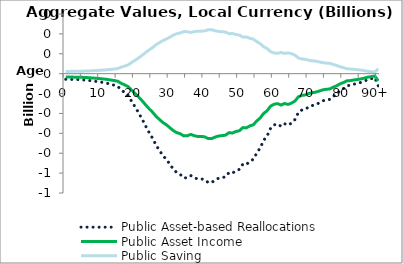
| Category | Public Asset-based Reallocations | Public Asset Income | Public Saving |
|---|---|---|---|
| 0 | -28.464 | -16.972 | 11.491 |
|  | -28.445 | -16.961 | 11.484 |
| 2 | -29.093 | -17.348 | 11.745 |
| 3 | -29.413 | -17.539 | 11.875 |
| 4 | -29.834 | -17.789 | 12.044 |
| 5 | -31.411 | -18.73 | 12.681 |
| 6 | -32.855 | -19.591 | 13.264 |
| 7 | -35.005 | -20.873 | 14.132 |
| 8 | -37.003 | -22.064 | 14.939 |
| 9 | -39.667 | -23.653 | 16.014 |
| 10 | -42.138 | -25.126 | 17.012 |
| 11 | -45.221 | -26.964 | 18.256 |
| 12 | -48.731 | -29.057 | 19.673 |
| 13 | -53.652 | -31.992 | 21.66 |
| 14 | -57.969 | -34.566 | 23.403 |
| 15 | -64.15 | -38.251 | 25.898 |
| 16 | -81.967 | -48.876 | 33.092 |
| 17 | -95.029 | -56.664 | 38.365 |
| 18 | -109.429 | -65.251 | 44.178 |
| 19 | -139.893 | -83.416 | 56.477 |
| 20 | -167.658 | -99.972 | 67.686 |
| 21 | -196.954 | -117.441 | 79.514 |
| 22 | -228.679 | -136.358 | 92.322 |
| 23 | -263.045 | -156.849 | 106.196 |
| 24 | -295.512 | -176.209 | 119.303 |
| 25 | -324.404 | -193.437 | 130.967 |
| 26 | -359.612 | -214.43 | 145.181 |
| 27 | -386.588 | -230.516 | 156.072 |
| 28 | -412.55 | -245.997 | 166.553 |
| 29 | -431.483 | -257.286 | 174.197 |
| 30 | -455.659 | -271.702 | 183.957 |
| 31 | -480.752 | -286.664 | 194.087 |
| 32 | -497.594 | -296.707 | 200.887 |
| 33 | -507.146 | -302.403 | 204.743 |
| 34 | -524.607 | -312.814 | 211.792 |
| 35 | -523.218 | -311.986 | 211.232 |
| 36 | -512.389 | -305.529 | 206.86 |
| 37 | -522.843 | -311.762 | 211.08 |
| 38 | -529.588 | -315.785 | 213.803 |
| 39 | -529.246 | -315.581 | 213.665 |
| 40 | -532.517 | -317.531 | 214.986 |
| 41 | -547.027 | -326.183 | 220.844 |
| 42 | -547.459 | -326.441 | 221.018 |
| 43 | -535.187 | -319.123 | 216.064 |
| 44 | -525.617 | -313.417 | 212.2 |
| 45 | -522.471 | -311.541 | 210.93 |
| 46 | -518.651 | -309.263 | 209.388 |
| 47 | -497.739 | -296.794 | 200.946 |
| 48 | -500.302 | -298.322 | 201.98 |
| 49 | -487.584 | -290.738 | 196.846 |
| 50 | -481.422 | -287.064 | 194.358 |
| 51 | -454.895 | -271.247 | 183.649 |
| 52 | -457.167 | -272.601 | 184.566 |
| 53 | -440.998 | -262.96 | 178.038 |
| 54 | -430.719 | -256.831 | 173.888 |
| 55 | -399.323 | -238.11 | 161.213 |
| 56 | -373.502 | -222.713 | 150.789 |
| 57 | -335.187 | -199.866 | 135.32 |
| 58 | -312.585 | -186.389 | 126.196 |
| 59 | -273.875 | -163.307 | 110.568 |
| 60 | -257.405 | -153.486 | 103.919 |
| 61 | -252.917 | -150.81 | 102.107 |
| 62 | -264.672 | -157.82 | 106.853 |
| 63 | -251.452 | -149.937 | 101.515 |
| 64 | -259.185 | -154.548 | 104.637 |
| 65 | -248.64 | -148.26 | 100.38 |
| 66 | -230.878 | -137.669 | 93.209 |
| 67 | -195.393 | -116.51 | 78.883 |
| 68 | -182.854 | -109.033 | 73.821 |
| 69 | -179.239 | -106.877 | 72.362 |
| 70 | -166.39 | -99.216 | 67.174 |
| 71 | -160.37 | -95.626 | 64.744 |
| 72 | -155.671 | -92.824 | 62.847 |
| 73 | -146.654 | -87.447 | 59.206 |
| 74 | -136.543 | -81.418 | 55.125 |
| 75 | -131.736 | -78.552 | 53.184 |
| 76 | -129.41 | -77.165 | 52.245 |
| 77 | -114.6 | -68.334 | 46.266 |
| 78 | -102.797 | -61.296 | 41.501 |
| 79 | -85.756 | -51.135 | 34.621 |
| 80 | -74.647 | -44.511 | 30.136 |
| 81 | -60.396 | -36.013 | 24.383 |
| 82 | -58.329 | -34.781 | 23.549 |
| 83 | -52.783 | -31.474 | 21.309 |
| 84 | -49.5 | -29.516 | 19.984 |
| 85 | -44.036 | -26.258 | 17.778 |
| 86 | -37.358 | -22.276 | 15.082 |
| 87 | -29.158 | -17.386 | 11.771 |
| 88 | -25.149 | -14.996 | 10.153 |
| 89 | -20.033 | -11.945 | 8.088 |
| 90+ | -60.927 | -36.33 | 24.597 |